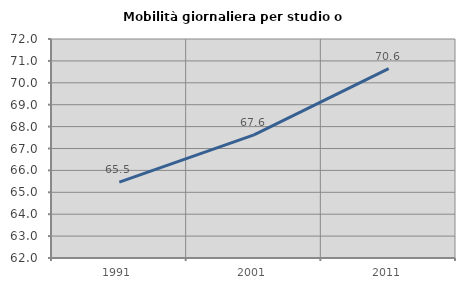
| Category | Mobilità giornaliera per studio o lavoro |
|---|---|
| 1991.0 | 65.462 |
| 2001.0 | 67.625 |
| 2011.0 | 70.645 |